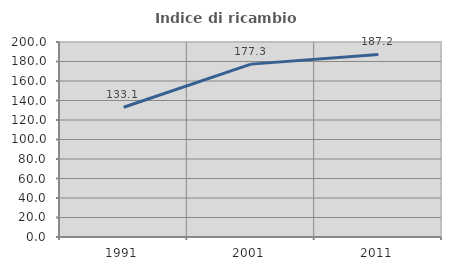
| Category | Indice di ricambio occupazionale  |
|---|---|
| 1991.0 | 133.073 |
| 2001.0 | 177.311 |
| 2011.0 | 187.186 |